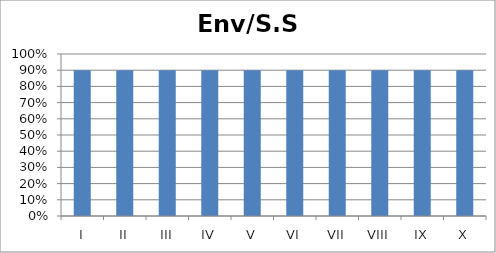
| Category | Env/S.S. |
|---|---|
| I | 0.9 |
| II | 0.9 |
| III | 0.9 |
| IV | 0.9 |
| V | 0.9 |
| VI | 0.9 |
| VII | 0.9 |
| VIII | 0.9 |
| IX | 0.9 |
| X | 0.9 |